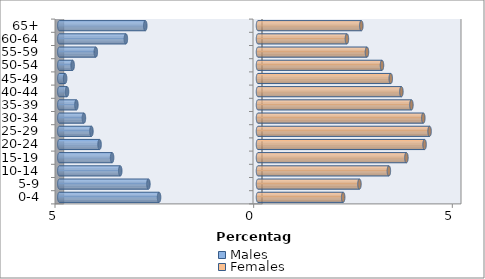
| Category | Males | Females |
|---|---|---|
| 0-4 | -2.49 | 2.143 |
| 5-9 | -2.758 | 2.553 |
| 10-14 | -3.467 | 3.294 |
| 15-19 | -3.672 | 3.735 |
| 20-24 | -3.987 | 4.192 |
| 25-29 | -4.192 | 4.318 |
| 30-34 | -4.381 | 4.161 |
| 35-39 | -4.571 | 3.861 |
| 40-44 | -4.807 | 3.609 |
| 45-49 | -4.854 | 3.341 |
| 50-54 | -4.665 | 3.121 |
| 55-59 | -4.082 | 2.742 |
| 60-64 | -3.325 | 2.238 |
| 65+ | -2.837 | 2.6 |